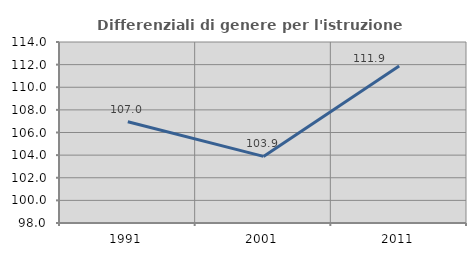
| Category | Differenziali di genere per l'istruzione superiore |
|---|---|
| 1991.0 | 106.95 |
| 2001.0 | 103.887 |
| 2011.0 | 111.882 |